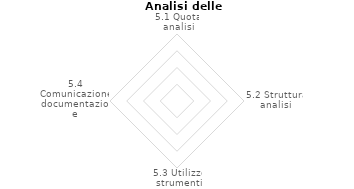
| Category | Series 2 |
|---|---|
| 5.1 Quota analisi | 0 |
| 5.2 Struttura analisi | 0 |
| 5.3 Utilizzo strumenti | 0 |
| 5.4 Comunicazione/documentazione | 0 |